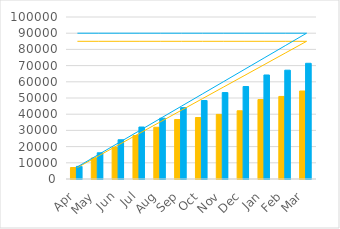
| Category | Series 0 | Series 1 |
|---|---|---|
| Apr | 7095 | 7784 |
| May | 12971 | 16180 |
| Jun | 19435 | 24219 |
| Jul | 26817 | 32087 |
| Aug | 31937 | 37516 |
| Sep | 36737 | 44050 |
| Oct | 37954 | 48463 |
| Nov | 39889 | 53359 |
| Dec | 42113 | 57085 |
| Jan | 49054 | 64215 |
| Feb | 50969 | 67170 |
| Mar | 54324 | 71427 |